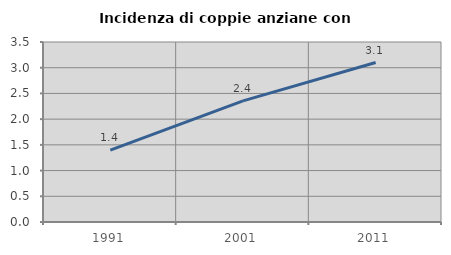
| Category | Incidenza di coppie anziane con figli |
|---|---|
| 1991.0 | 1.398 |
| 2001.0 | 2.355 |
| 2011.0 | 3.101 |